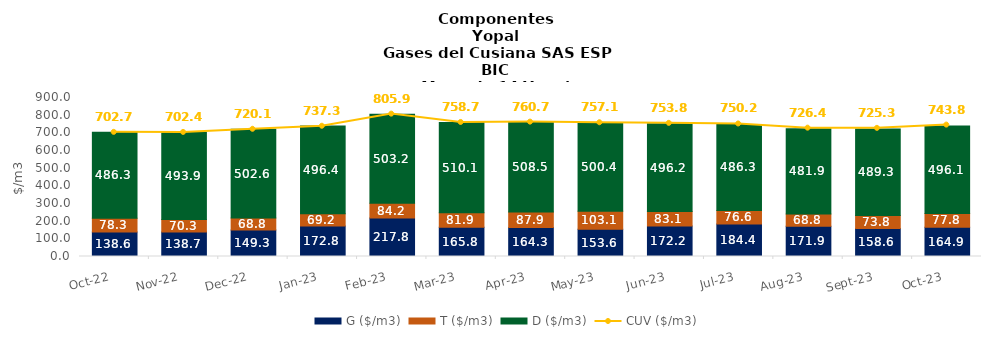
| Category | G ($/m3) | T ($/m3) | D ($/m3) |
|---|---|---|---|
| 2022-10-01 | 138.55 | 78.32 | 486.3 |
| 2022-11-01 | 138.65 | 70.31 | 493.89 |
| 2022-12-01 | 149.33 | 68.76 | 502.55 |
| 2023-01-01 | 172.82 | 69.18 | 496.38 |
| 2023-02-01 | 217.82 | 84.19 | 503.15 |
| 2023-03-01 | 165.84 | 81.88 | 510.12 |
| 2023-04-01 | 164.25 | 87.89 | 508.45 |
| 2023-05-01 | 153.57 | 103.08 | 500.4 |
| 2023-06-01 | 172.16 | 83.07 | 496.23 |
| 2023-07-01 | 184.42 | 76.55 | 486.26 |
| 2023-08-01 | 171.91 | 68.78 | 481.89 |
| 2023-09-01 | 158.55 | 73.83 | 489.25 |
| 2023-10-01 | 164.94 | 77.79 | 496.13 |